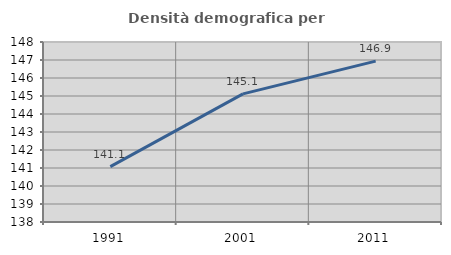
| Category | Densità demografica |
|---|---|
| 1991.0 | 141.076 |
| 2001.0 | 145.12 |
| 2011.0 | 146.94 |